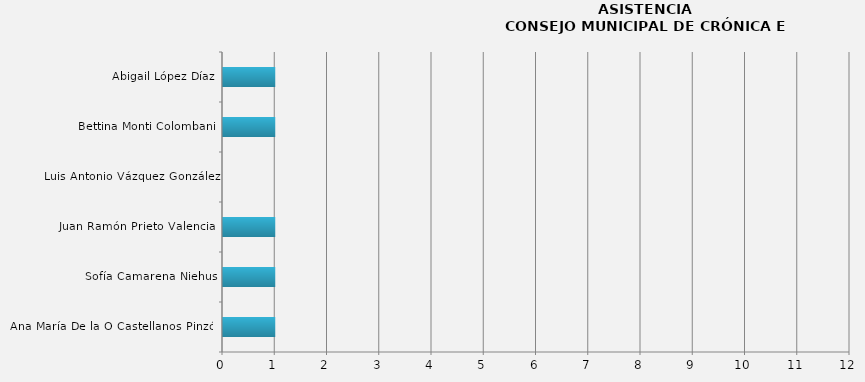
| Category | Series 0 |
|---|---|
| Ana María De la O Castellanos Pinzón | 1 |
| Sofía Camarena Niehus | 1 |
| Juan Ramón Prieto Valencia  | 1 |
| Luis Antonio Vázquez González | 0 |
| Bettina Monti Colombani | 1 |
| Abigail López Díaz | 1 |